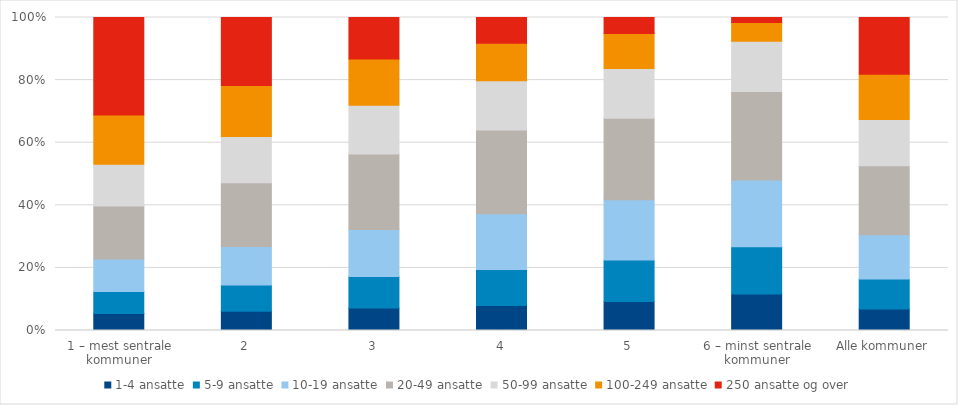
| Category | 1-4 ansatte | 5-9 ansatte | 10-19 ansatte | 20-49 ansatte | 50-99 ansatte | 100-249 ansatte | 250 ansatte og over |
|---|---|---|---|---|---|---|---|
| 1 – mest sentrale kommuner | 5.4 | 7.045 | 10.437 | 16.914 | 13.358 | 15.672 | 31.173 |
| 2 | 6.127 | 8.38 | 12.33 | 20.392 | 14.733 | 16.352 | 21.686 |
| 3 | 7.162 | 10.12 | 14.999 | 24.109 | 15.54 | 14.824 | 13.247 |
| 4 | 7.988 | 11.538 | 17.811 | 26.738 | 15.695 | 11.977 | 8.254 |
| 5 | 9.25 | 13.252 | 19.304 | 26.023 | 15.912 | 11.149 | 5.11 |
| 6 – minst sentrale kommuner | 11.648 | 15.125 | 21.303 | 28.249 | 16.065 | 6.001 | 1.607 |
| Alle kommuner | 6.909 | 9.541 | 14.142 | 22.006 | 14.853 | 14.4 | 18.15 |